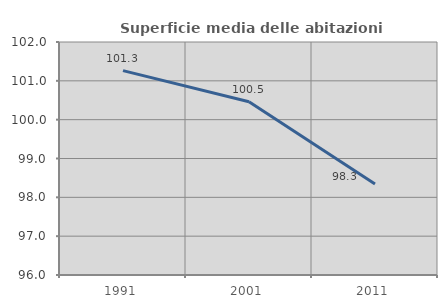
| Category | Superficie media delle abitazioni occupate |
|---|---|
| 1991.0 | 101.262 |
| 2001.0 | 100.463 |
| 2011.0 | 98.34 |